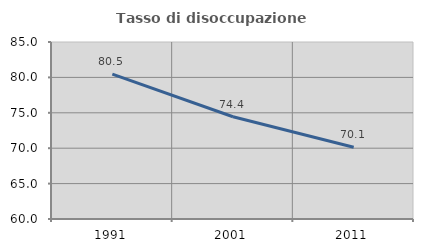
| Category | Tasso di disoccupazione giovanile  |
|---|---|
| 1991.0 | 80.468 |
| 2001.0 | 74.44 |
| 2011.0 | 70.135 |